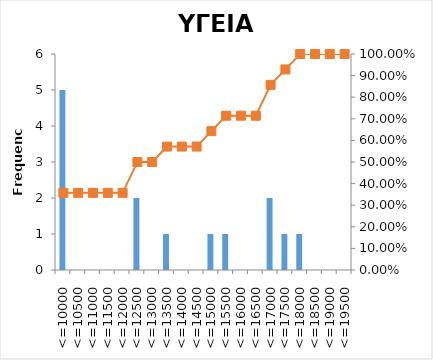
| Category | Series 0 |
|---|---|
| <=10000 | 5 |
| <=10500 | 0 |
| <=11000 | 0 |
| <=11500 | 0 |
| <=12000 | 0 |
| <=12500 | 2 |
| <=13000 | 0 |
| <=13500 | 1 |
| <=14000 | 0 |
| <=14500 | 0 |
| <=15000 | 1 |
| <=15500 | 1 |
| <=16000 | 0 |
| <=16500 | 0 |
| <=17000 | 2 |
| <=17500 | 1 |
| <=18000 | 1 |
| <=18500 | 0 |
| <=19000 | 0 |
| <=19500 | 0 |